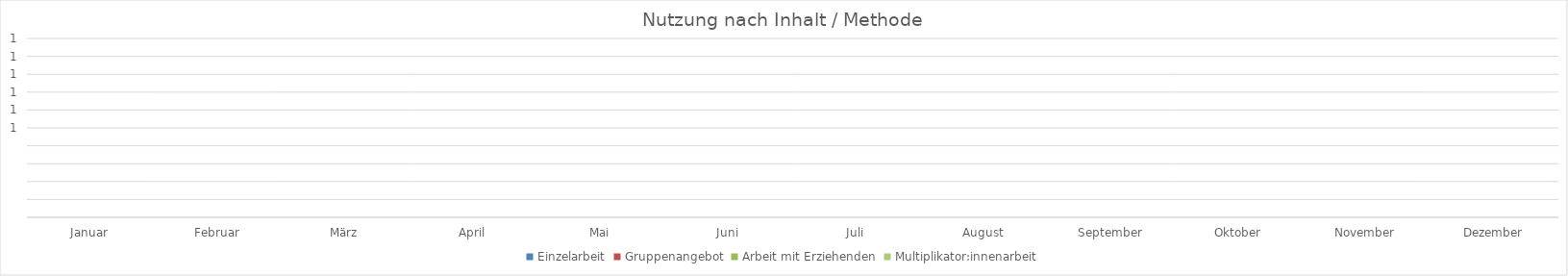
| Category | Einzelarbeit | Gruppenangebot | Arbeit mit Erziehenden | Multiplikator:innenarbeit |
|---|---|---|---|---|
| Januar | 0 | 0 | 0 | 0 |
| Februar | 0 | 0 | 0 | 0 |
| März | 0 | 0 | 0 | 0 |
| April | 0 | 0 | 0 | 0 |
| Mai | 0 | 0 | 0 | 0 |
| Juni | 0 | 0 | 0 | 0 |
| Juli | 0 | 0 | 0 | 0 |
| August | 0 | 0 | 0 | 0 |
| September | 0 | 0 | 0 | 0 |
| Oktober | 0 | 0 | 0 | 0 |
| November | 0 | 0 | 0 | 0 |
| Dezember | 0 | 0 | 0 | 0 |